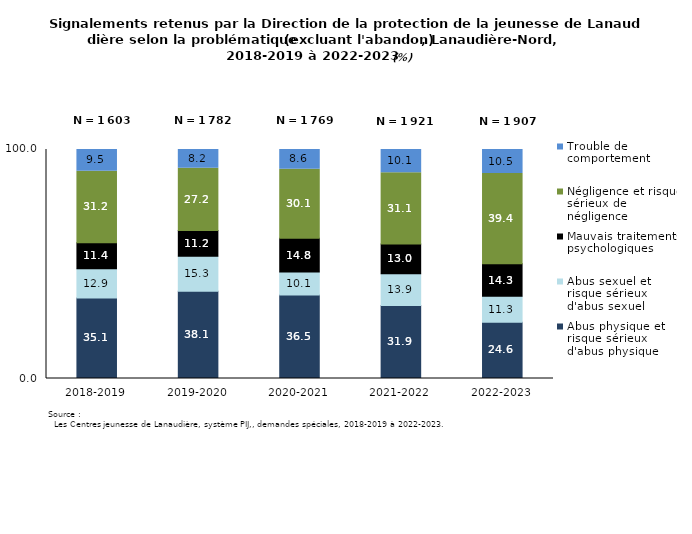
| Category | Abus physique et risque sérieux d'abus physique | Abus sexuel et risque sérieux d'abus sexuel | Mauvais traitements psychologiques | Négligence et risque sérieux de négligence | Trouble de comportement |
|---|---|---|---|---|---|
| 2018-2019 | 35.122 | 12.851 | 11.354 | 31.192 | 9.482 |
| 2019-2020 | 38.103 | 15.32 | 11.167 | 27.217 | 8.193 |
| 2020-2021 | 36.461 | 10.062 | 14.754 | 30.073 | 8.649 |
| 2021-2022 | 31.858 | 13.899 | 13.014 | 31.13 | 10.099 |
| 2022-2023 | 24.594 | 11.274 | 14.263 | 39.381 | 10.488 |